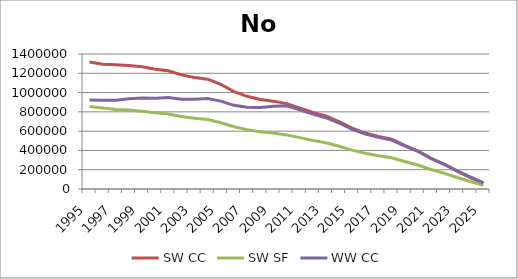
| Category | SW CC | SW SF | WW CC | Series 4 |
|---|---|---|---|---|
| 1995.0 | 1316245.055 | 855202.564 | 922673.35 |  |
| 1996.0 | 1293580.406 | 840342.641 | 921259.331 |  |
| 1997.0 | 1287795.818 | 825036.921 | 919802.892 |  |
| 1998.0 | 1281837.693 | 818052.028 | 935102.76 |  |
| 1999.0 | 1266920.824 | 806467.589 | 942461.623 |  |
| 2000.0 | 1242776.449 | 790145.617 | 941641.252 |  |
| 2001.0 | 1226687.742 | 777723.985 | 949196.271 |  |
| 2002.0 | 1183776.374 | 751759.705 | 931777.939 |  |
| 2003.0 | 1157137.665 | 733796.496 | 930637.058 |  |
| 2004.0 | 1138479.795 | 719684.391 | 937861.951 |  |
| 2005.0 | 1084142.189 | 687588.922 | 911703.59 |  |
| 2006.0 | 1010614.455 | 645750.59 | 867960.478 |  |
| 2007.0 | 961220.889 | 615827.108 | 848105.073 |  |
| 2008.0 | 927905.515 | 593785.921 | 844454.006 |  |
| 2009.0 | 911150.681 | 579863.499 | 857493.407 |  |
| 2010.0 | 885113.201 | 561133.404 | 862523.99 |  |
| 2011.0 | 840734.597 | 533061.406 | 819879.71 |  |
| 2012.0 | 795024.635 | 504147.248 | 775956.101 |  |
| 2013.0 | 756723.374 | 478755.665 | 739114.784 |  |
| 2014.0 | 699713.075 | 443822.335 | 684368.227 |  |
| 2015.0 | 632212.468 | 403451.005 | 619579.274 |  |
| 2016.0 | 580246.842 | 370648.536 | 569646.652 |  |
| 2017.0 | 544282.247 | 345641.992 | 535016.052 |  |
| 2018.0 | 516018.714 | 324275.251 | 507746.534 |  |
| 2019.0 | 451787.276 | 284707.509 | 446058.93 |  |
| 2020.0 | 394408.894 | 248342.734 | 390920.697 |  |
| 2021.0 | 317749.161 | 202107.016 | 317328.318 |  |
| 2022.0 | 256349.636 | 163264.227 | 258328.168 |  |
| 2023.0 | 184328.125 | 118866.154 | 189158.013 |  |
| 2024.0 | 118925.969 | 77526.138 | 126312.753 |  |
| 2025.0 | 60341.748 | 39335.922 | 63262.136 |  |